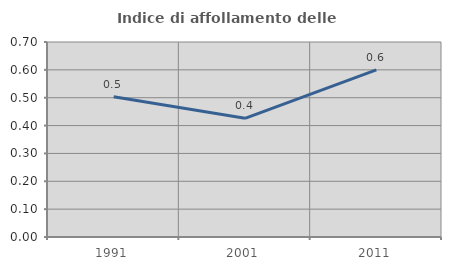
| Category | Indice di affollamento delle abitazioni  |
|---|---|
| 1991.0 | 0.504 |
| 2001.0 | 0.426 |
| 2011.0 | 0.6 |